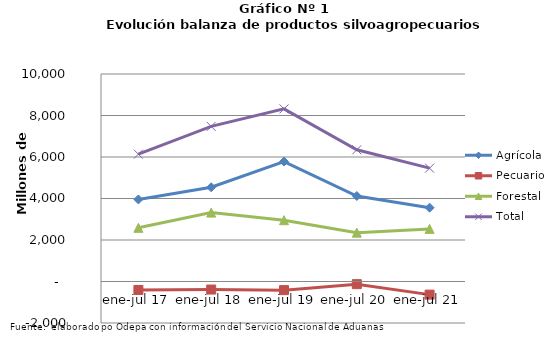
| Category | Agrícola | Pecuario | Forestal | Total |
|---|---|---|---|---|
| ene-jul 17 | 3955485 | -407986 | 2587121 | 6134620 |
| ene-jul 18 | 4542112 | -387406 | 3320566 | 7475272 |
| ene-jul 19 | 5779471 | -415868 | 2955438 | 8319041 |
| ene-jul 20 | 4119637 | -128121 | 2355393 | 6346909 |
| ene-jul 21 | 3557757 | -631930 | 2535873 | 5461700 |